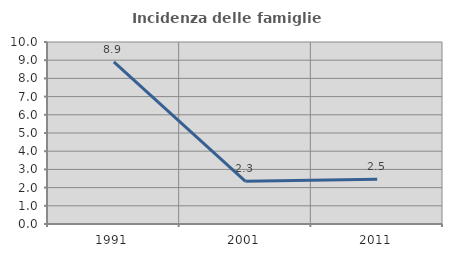
| Category | Incidenza delle famiglie numerose |
|---|---|
| 1991.0 | 8.905 |
| 2001.0 | 2.346 |
| 2011.0 | 2.453 |